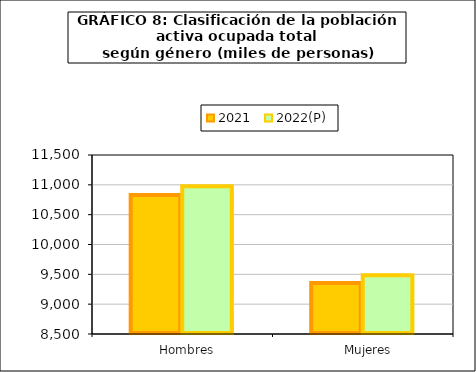
| Category | 2021 | 2022(P) |
|---|---|---|
|    Hombres | 10830.9 | 10977.7 |
|    Mujeres | 9354.1 | 9486.2 |